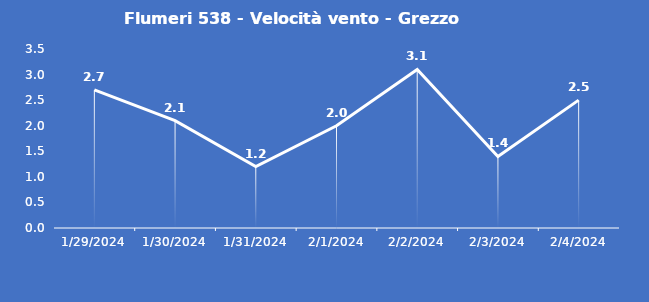
| Category | Flumeri 538 - Velocità vento - Grezzo (m/s) |
|---|---|
| 1/29/24 | 2.7 |
| 1/30/24 | 2.1 |
| 1/31/24 | 1.2 |
| 2/1/24 | 2 |
| 2/2/24 | 3.1 |
| 2/3/24 | 1.4 |
| 2/4/24 | 2.5 |